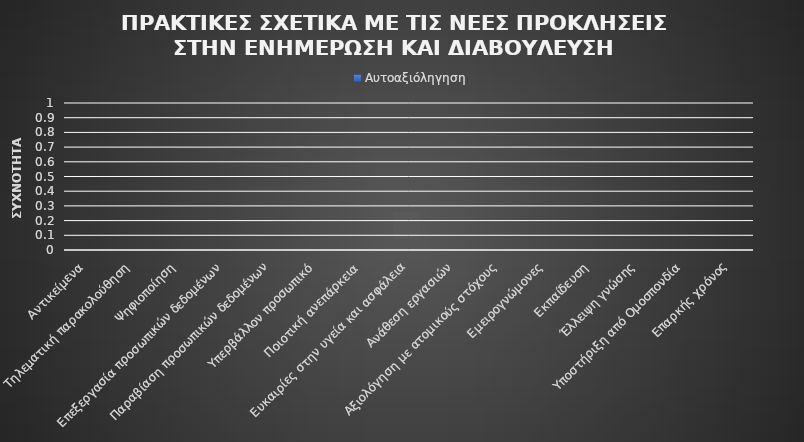
| Category | Αυτοαξιόληγηση |
|---|---|
| Αντικείμενα | 0 |
| Τηλεματική παρακολούθηση | 0 |
| Ψηφιοποίηση | 0 |
| Επεξεργασία προσωπικών δεδομένων | 0 |
| Παραβίαση προσωπικών δεδομένων | 0 |
| Υπερβάλλον προσωπικό | 0 |
| Ποιοτική ανεπάρκεια | 0 |
| Ευκαιρίες στην υγεία και ασφάλεια | 0 |
| Ανάθεση εργασιών | 0 |
| Αξιολόγηση με ατομικούς στόχους | 0 |
| Εμειρογνώμονες | 0 |
| Εκπαίδευση | 0 |
| Έλλειψη γνώσης | 0 |
| Υποστήριξη από Ομοσπονδία | 0 |
| Επαρκής χρόνος | 0 |